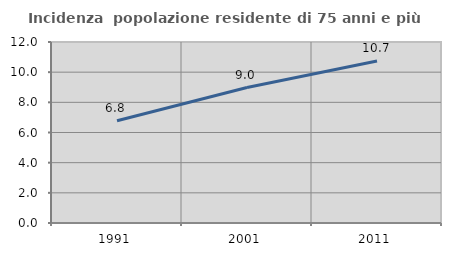
| Category | Incidenza  popolazione residente di 75 anni e più |
|---|---|
| 1991.0 | 6.783 |
| 2001.0 | 8.979 |
| 2011.0 | 10.735 |